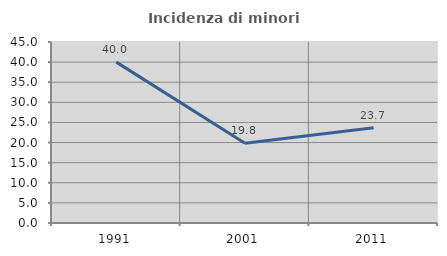
| Category | Incidenza di minori stranieri |
|---|---|
| 1991.0 | 40 |
| 2001.0 | 19.828 |
| 2011.0 | 23.66 |